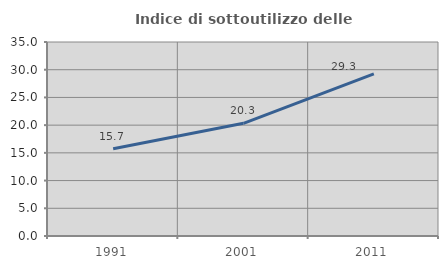
| Category | Indice di sottoutilizzo delle abitazioni  |
|---|---|
| 1991.0 | 15.724 |
| 2001.0 | 20.328 |
| 2011.0 | 29.261 |